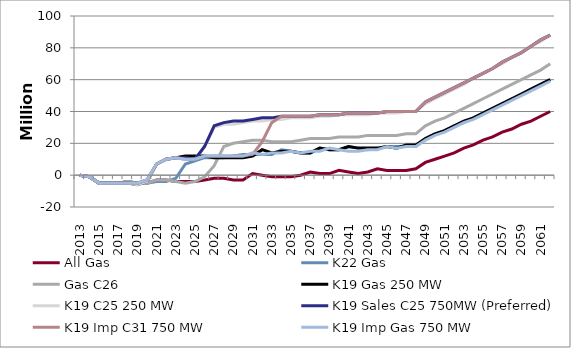
| Category | All Gas | K22 Gas | Gas C26 | K19 Gas 250 MW | K19 C25 250 MW | K19 Sales C25 750MW (Preferred) | K19 Imp C31 750 MW | K19 Imp Gas 750 MW |
|---|---|---|---|---|---|---|---|---|
| 2013.0 | 0 | 0 | 0 | 0 | 0 | 0 | 0 | 0 |
| 2014.0 | -1 | -1 | -1 | -1 | -1 | -1 | -1 | -1 |
| 2015.0 | -5 | -5 | -5 | -5 | -5 | -5 | -5 | -5 |
| 2016.0 | -5 | -5 | -5 | -5 | -5 | -5 | -5 | -5 |
| 2017.0 | -5 | -5 | -5 | -5 | -5 | -5 | -5 | -5 |
| 2018.0 | -4 | -4 | -4 | -5 | -5 | -5 | -5 | -5 |
| 2019.0 | -5 | -5 | -5 | -6 | -6 | -5 | -5 | -5 |
| 2020.0 | -5 | -5 | -5 | -4 | -4 | -3 | -3 | -3 |
| 2021.0 | -3 | -4 | -3 | 7 | 7 | 7 | 7 | 7 |
| 2022.0 | -3 | -4 | -3 | 10 | 10 | 10 | 10 | 10 |
| 2023.0 | -4 | -2 | -4 | 11 | 11 | 11 | 11 | 11 |
| 2024.0 | -4 | 7 | -5 | 12 | 10 | 11 | 10 | 10 |
| 2025.0 | -4 | 9 | -4 | 12 | 10 | 10 | 10 | 10 |
| 2026.0 | -3 | 11 | -1 | 12 | 18 | 18 | 12 | 12 |
| 2027.0 | -2 | 11 | 6 | 11 | 30 | 31 | 12 | 12 |
| 2028.0 | -2 | 11 | 18 | 11 | 32 | 33 | 12 | 12 |
| 2029.0 | -3 | 12 | 20 | 11 | 32 | 34 | 12 | 12 |
| 2030.0 | -3 | 13 | 21 | 11 | 33 | 34 | 12 | 12 |
| 2031.0 | 1 | 13 | 22 | 12 | 34 | 35 | 13 | 14 |
| 2032.0 | 0 | 13 | 22 | 16 | 34 | 36 | 21 | 13 |
| 2033.0 | -1 | 13 | 21 | 14 | 35 | 36 | 33 | 14 |
| 2034.0 | -1 | 16 | 21 | 15 | 35 | 37 | 37 | 14 |
| 2035.0 | -1 | 15 | 21 | 15 | 36 | 37 | 37 | 15 |
| 2036.0 | 0 | 14 | 22 | 14 | 36 | 37 | 37 | 14 |
| 2037.0 | 2 | 14 | 23 | 14 | 36 | 37 | 37 | 15 |
| 2038.0 | 1 | 17 | 23 | 17 | 37 | 38 | 38 | 15 |
| 2039.0 | 1 | 16 | 23 | 16 | 37 | 38 | 38 | 17 |
| 2040.0 | 3 | 16 | 24 | 16 | 38 | 38 | 38 | 16 |
| 2041.0 | 2 | 18 | 24 | 18 | 38 | 39 | 39 | 15 |
| 2042.0 | 1 | 17 | 24 | 17 | 38 | 39 | 39 | 15 |
| 2043.0 | 2 | 16 | 25 | 17 | 38 | 39 | 39 | 16 |
| 2044.0 | 4 | 17 | 25 | 17 | 39 | 39 | 39 | 16 |
| 2045.0 | 3 | 18 | 25 | 18 | 39 | 40 | 40 | 18 |
| 2046.0 | 3 | 18 | 25 | 17 | 39 | 40 | 40 | 17 |
| 2047.0 | 3 | 18 | 26 | 19 | 40 | 40 | 40 | 18 |
| 2048.0 | 4 | 18 | 26 | 19 | 40 | 40 | 40 | 18 |
| 2049.0 | 8 | 23 | 31 | 23 | 45 | 46 | 46 | 22 |
| 2050.0 | 10 | 26 | 34 | 26 | 48 | 49 | 49 | 25 |
| 2051.0 | 12 | 28 | 36 | 28 | 51 | 52 | 52 | 27 |
| 2052.0 | 14 | 31 | 39 | 31 | 54 | 55 | 55 | 30 |
| 2053.0 | 17 | 33 | 42 | 34 | 57 | 58 | 58 | 33 |
| 2054.0 | 19 | 36 | 45 | 36 | 61 | 61 | 61 | 35 |
| 2055.0 | 22 | 39 | 48 | 39 | 64 | 64 | 64 | 38 |
| 2056.0 | 24 | 42 | 51 | 42 | 67 | 67 | 67 | 41 |
| 2057.0 | 27 | 45 | 54 | 45 | 70 | 71 | 71 | 44 |
| 2058.0 | 29 | 48 | 57 | 48 | 74 | 74 | 74 | 47 |
| 2059.0 | 32 | 51 | 60 | 51 | 77 | 77 | 77 | 50 |
| 2060.0 | 34 | 54 | 63 | 54 | 81 | 81 | 81 | 53 |
| 2061.0 | 37 | 57 | 66 | 57 | 84 | 85 | 85 | 56 |
| 2062.0 | 40 | 60 | 70 | 60 | 88 | 88 | 88 | 59 |